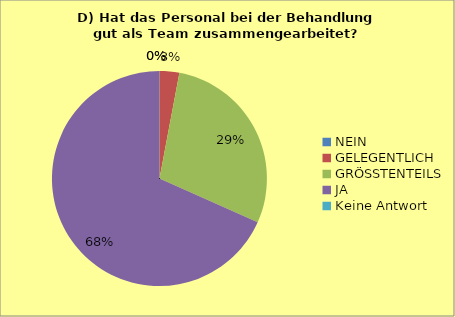
| Category | 8D |
|---|---|
| NEIN | 0 |
| GELEGENTLICH | 3 |
| GRÖSSTENTEILS | 29 |
| JA | 69 |
| Keine Antwort | 0 |